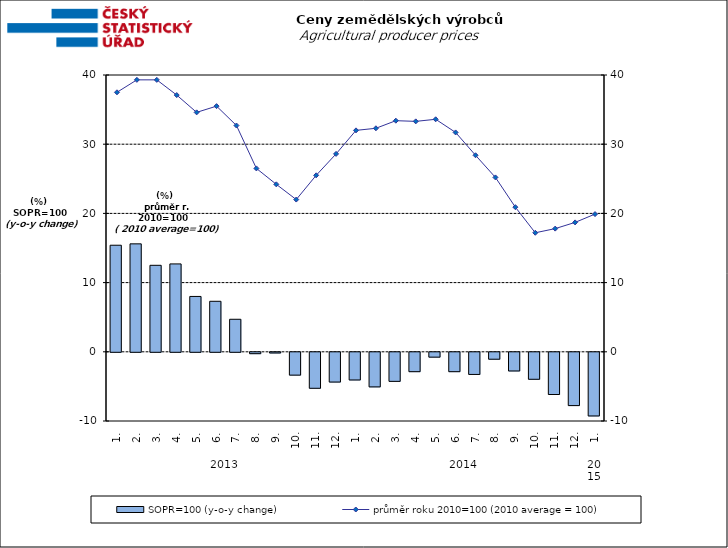
| Category | SOPR=100 (y-o-y change)   |
|---|---|
| 0 | 15.4 |
| 1 | 15.6 |
| 2 | 12.5 |
| 3 | 12.7 |
| 4 | 8 |
| 5 | 7.3 |
| 6 | 4.7 |
| 7 | -0.2 |
| 8 | -0.1 |
| 9 | -3.3 |
| 10 | -5.2 |
| 11 | -4.3 |
| 12 | -4 |
| 13 | -5 |
| 14 | -4.2 |
| 15 | -2.8 |
| 16 | -0.7 |
| 17 | -2.8 |
| 18 | -3.2 |
| 19 | -1 |
| 20 | -2.7 |
| 21 | -3.9 |
| 22 | -6.1 |
| 23 | -7.7 |
| 24 | -9.2 |